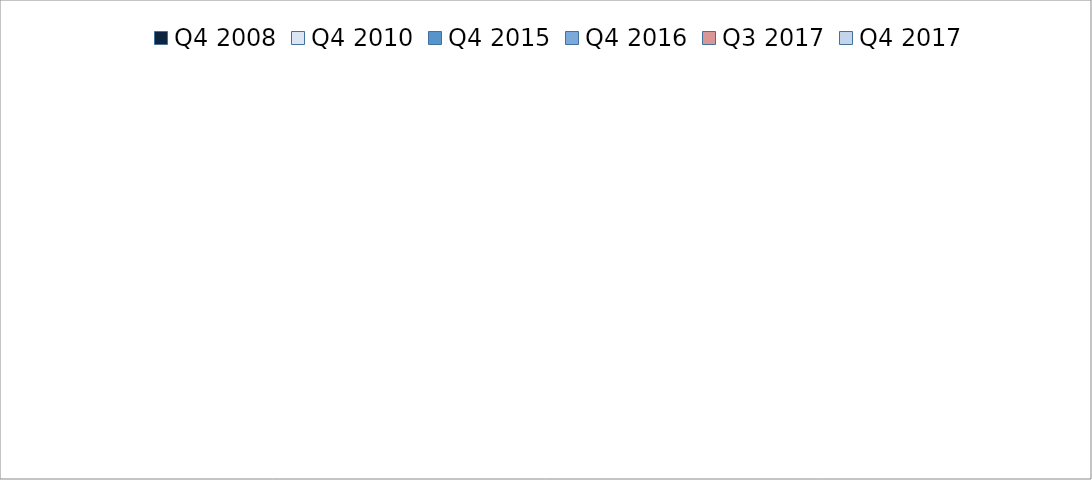
| Category | Q4 2008 | Q4 2010 | Q4 2015 | Q4 2016 | Q3 2017 | Q4 2017 |
|---|---|---|---|---|---|---|
| Food, beverages, and tobacco | 305.937 | 350.414 | 360.292 | 350.728 | 364.78 | 383.982 |
| Clothing, textiles and footwear | 292.783 | 261.604 | 231.25 | 236.204 | 230.196 | 250.152 |
| Wood and paper | 173.686 | 160.337 | 96.607 | 111.001 | 119.913 | 127.744 |
| Publishing 
and printing | 89.555 | 80.106 | 95.491 | 83.561 | 74.499 | 63.935 |
| Petroleum, chemicals, rubber, and plastic | 256.679 | 205.35 | 212.289 | 221.61 | 244.154 | 218.923 |
| Glass and non-
metallic minerals | 132.402 | 120.95 | 101.507 | 104.969 | 118.86 | 104.623 |
| Metals and 
metal products | 341.762 | 312.999 | 288.895 | 275.676 | 271.716 | 277.15 |
| Machinery, equiptment, and 
appliances | 230.773 | 153.967 | 145.277 | 130.837 | 141.796 | 154.184 |
| Transport 
equipment | 165.776 | 138.668 | 99.111 | 106.303 | 99.469 | 107.211 |
| Furniture, 
and other | 106.139 | 101.764 | 107.424 | 104.596 | 81.797 | 102.719 |